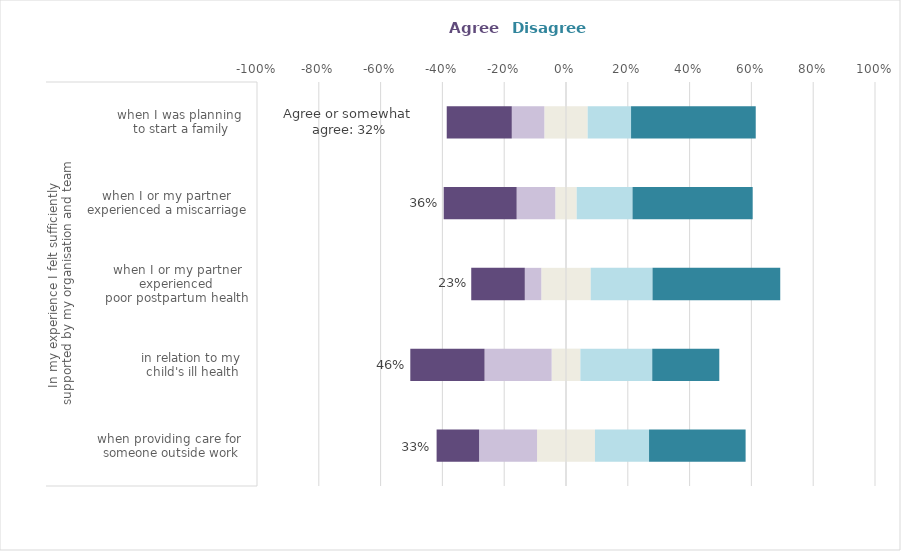
| Category | Neither agree nor disagree | Somewhat agree | Agree | Somewhat disagree | Disagree |
|---|---|---|---|---|---|
| 0 | 0.094 | -0.188 | -0.138 | 0.175 | 0.312 |
| 1 | 0.047 | -0.217 | -0.24 | 0.233 | 0.217 |
| 2 | 0.08 | -0.053 | -0.173 | 0.2 | 0.413 |
| 3 | 0.035 | -0.125 | -0.236 | 0.181 | 0.389 |
| 4 | 0.07 | -0.105 | -0.211 | 0.14 | 0.404 |